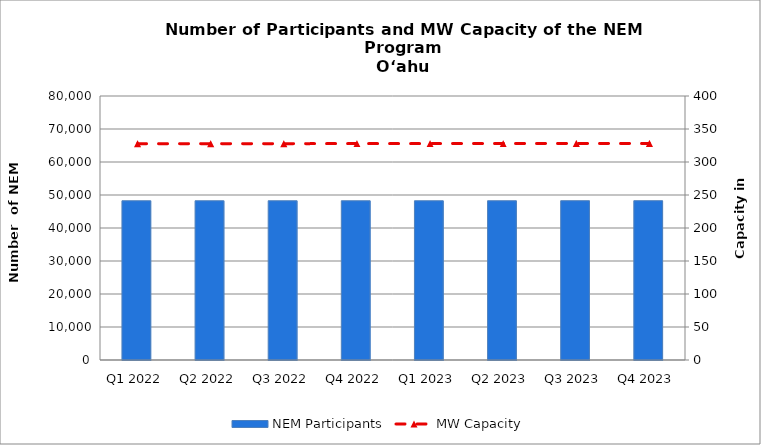
| Category | NEM Participants |
|---|---|
| Q1 2022 | 48255 |
| Q2 2022 | 48253 |
| Q3 2022 | 48254 |
| Q4 2022 | 48255 |
| Q1 2023 | 48257 |
| Q2 2023 | 48262 |
| Q3 2023 | 48272 |
| Q4 2023 | 48273 |